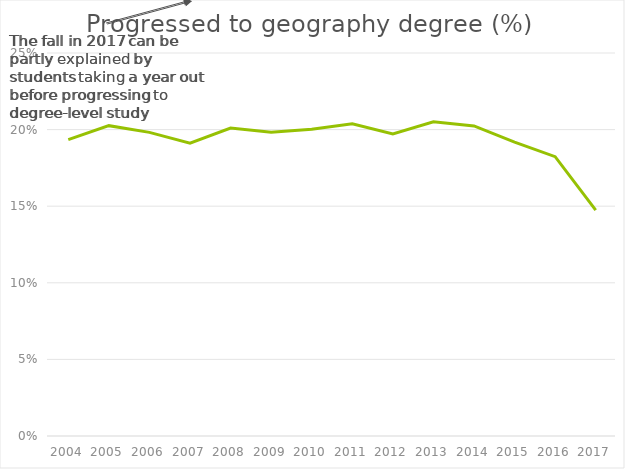
| Category | Percent progressing to geography degree |
|---|---|
| 2004.0 | 0.193 |
| 2005.0 | 0.203 |
| 2006.0 | 0.198 |
| 2007.0 | 0.191 |
| 2008.0 | 0.201 |
| 2009.0 | 0.198 |
| 2010.0 | 0.2 |
| 2011.0 | 0.204 |
| 2012.0 | 0.197 |
| 2013.0 | 0.205 |
| 2014.0 | 0.202 |
| 2015.0 | 0.192 |
| 2016.0 | 0.182 |
| 2017.0 | 0.147 |